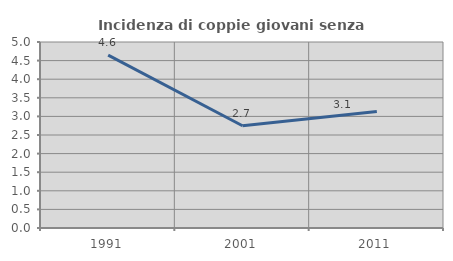
| Category | Incidenza di coppie giovani senza figli |
|---|---|
| 1991.0 | 4.648 |
| 2001.0 | 2.748 |
| 2011.0 | 3.13 |